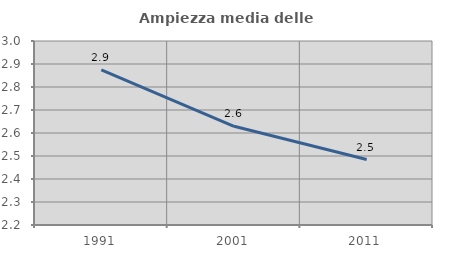
| Category | Ampiezza media delle famiglie |
|---|---|
| 1991.0 | 2.875 |
| 2001.0 | 2.629 |
| 2011.0 | 2.485 |